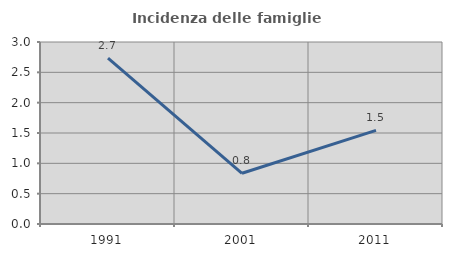
| Category | Incidenza delle famiglie numerose |
|---|---|
| 1991.0 | 2.734 |
| 2001.0 | 0.836 |
| 2011.0 | 1.543 |